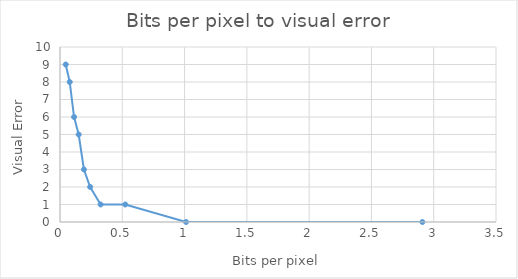
| Category | Series 0 |
|---|---|
| 2.909 | 0 |
| 1.012 | 0 |
| 0.524 | 1 |
| 0.326 | 1 |
| 0.242 | 2 |
| 0.192 | 3 |
| 0.15 | 5 |
| 0.113 | 6 |
| 0.078 | 8 |
| 0.046 | 9 |